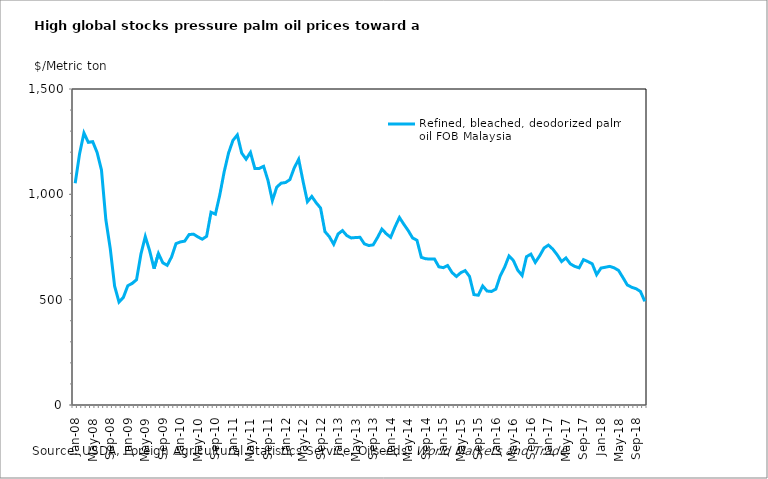
| Category | Refined, bleached, deodorized palm oil |
|---|---|
| 2008-01-01 | 1053 |
| 2008-02-01 | 1192 |
| 2008-03-01 | 1291 |
| 2008-04-01 | 1247 |
| 2008-05-01 | 1250 |
| 2008-06-01 | 1199 |
| 2008-07-01 | 1115 |
| 2008-08-01 | 879 |
| 2008-09-01 | 743 |
| 2008-10-01 | 564 |
| 2008-11-01 | 489 |
| 2008-12-01 | 511 |
| 2009-01-01 | 566 |
| 2009-02-01 | 577 |
| 2009-03-01 | 595 |
| 2009-04-01 | 716 |
| 2009-05-01 | 799 |
| 2009-06-01 | 732 |
| 2009-07-01 | 647 |
| 2009-08-01 | 719 |
| 2009-09-01 | 675 |
| 2009-10-01 | 663 |
| 2009-11-01 | 703 |
| 2009-12-01 | 766 |
| 2010-01-01 | 774 |
| 2010-02-01 | 778 |
| 2010-03-01 | 809 |
| 2010-04-01 | 811 |
| 2010-05-01 | 798 |
| 2010-06-01 | 787 |
| 2010-07-01 | 801 |
| 2010-08-01 | 915 |
| 2010-09-01 | 906 |
| 2010-10-01 | 997 |
| 2010-11-01 | 1107 |
| 2010-12-01 | 1196 |
| 2011-01-01 | 1256 |
| 2011-02-01 | 1282 |
| 2011-03-01 | 1196 |
| 2011-04-01 | 1167 |
| 2011-05-01 | 1199 |
| 2011-06-01 | 1123 |
| 2011-07-01 | 1123 |
| 2011-08-01 | 1133 |
| 2011-09-01 | 1066 |
| 2011-10-01 | 970 |
| 2011-11-01 | 1034 |
| 2011-12-01 | 1053 |
| 2012-01-01 | 1056 |
| 2012-02-01 | 1070 |
| 2012-03-01 | 1126 |
| 2012-04-01 | 1166 |
| 2012-05-01 | 1062 |
| 2012-06-01 | 965 |
| 2012-07-01 | 990 |
| 2012-08-01 | 960 |
| 2012-09-01 | 935 |
| 2012-10-01 | 823 |
| 2012-11-01 | 799 |
| 2012-12-01 | 763 |
| 2013-01-01 | 812 |
| 2013-02-01 | 828 |
| 2013-03-01 | 804 |
| 2013-04-01 | 793 |
| 2013-05-01 | 795 |
| 2013-06-01 | 796 |
| 2013-07-01 | 765 |
| 2013-08-01 | 757 |
| 2013-09-01 | 760 |
| 2013-10-01 | 795 |
| 2013-11-01 | 835 |
| 2013-12-01 | 813 |
| 2014-01-01 | 796 |
| 2014-02-01 | 846 |
| 2014-03-01 | 890 |
| 2014-04-01 | 858 |
| 2014-05-01 | 828 |
| 2014-06-01 | 793 |
| 2014-07-01 | 782 |
| 2014-08-01 | 701 |
| 2014-09-01 | 694 |
| 2014-10-01 | 693 |
| 2014-11-01 | 693 |
| 2014-12-01 | 656 |
| 2015-01-01 | 652 |
| 2015-02-01 | 662 |
| 2015-03-01 | 629 |
| 2015-04-01 | 610 |
| 2015-05-01 | 628 |
| 2015-06-01 | 638 |
| 2015-07-01 | 610 |
| 2015-08-01 | 524 |
| 2015-09-01 | 521 |
| 2015-10-01 | 565 |
| 2015-11-01 | 541 |
| 2015-12-01 | 539 |
| 2016-01-01 | 550 |
| 2016-02-01 | 613 |
| 2016-03-01 | 654 |
| 2016-04-01 | 707 |
| 2016-05-01 | 686 |
| 2016-06-01 | 640 |
| 2016-07-01 | 615 |
| 2016-08-01 | 704 |
| 2016-09-01 | 716 |
| 2016-10-01 | 677 |
| 2016-11-01 | 708 |
| 2016-12-01 | 745 |
| 2017-01-01 | 759 |
| 2017-02-01 | 740 |
| 2017-03-01 | 713 |
| 2017-04-01 | 681 |
| 2017-05-01 | 698 |
| 2017-06-01 | 670 |
| 2017-07-01 | 658 |
| 2017-08-01 | 651 |
| 2017-09-01 | 690 |
| 2017-10-01 | 681 |
| 2017-11-01 | 670 |
| 2017-12-01 | 619 |
| 2018-01-01 | 650 |
| 2018-02-01 | 654 |
| 2018-03-01 | 658 |
| 2018-04-01 | 651 |
| 2018-05-01 | 639 |
| 2018-06-01 | 605 |
| 2018-07-01 | 570 |
| 2018-08-01 | 559 |
| 2018-09-01 | 552 |
| 2018-10-01 | 539 |
| 2018-11-01 | 492 |